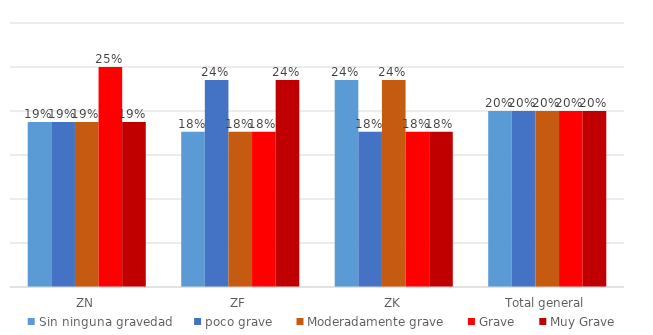
| Category | Sin ninguna gravedad | poco grave | Moderadamente grave | Grave | Muy Grave |
|---|---|---|---|---|---|
| ZN | 0.188 | 0.188 | 0.188 | 0.25 | 0.188 |
| ZF | 0.176 | 0.235 | 0.176 | 0.176 | 0.235 |
| ZK | 0.235 | 0.176 | 0.235 | 0.176 | 0.176 |
| Total general | 0.2 | 0.2 | 0.2 | 0.2 | 0.2 |